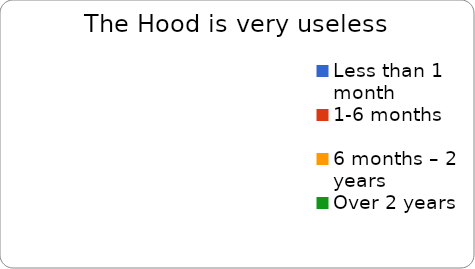
| Category | Very useless |
|---|---|
| Less than 1 month | 0 |
| 1-6 months | 0 |
| 6 months – 2 years | 0 |
| Over 2 years | 0 |